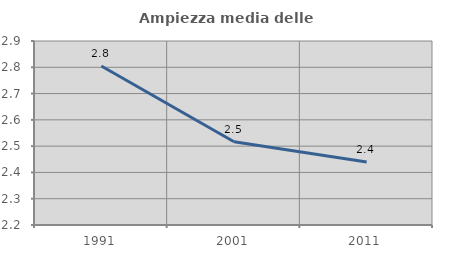
| Category | Ampiezza media delle famiglie |
|---|---|
| 1991.0 | 2.805 |
| 2001.0 | 2.517 |
| 2011.0 | 2.44 |